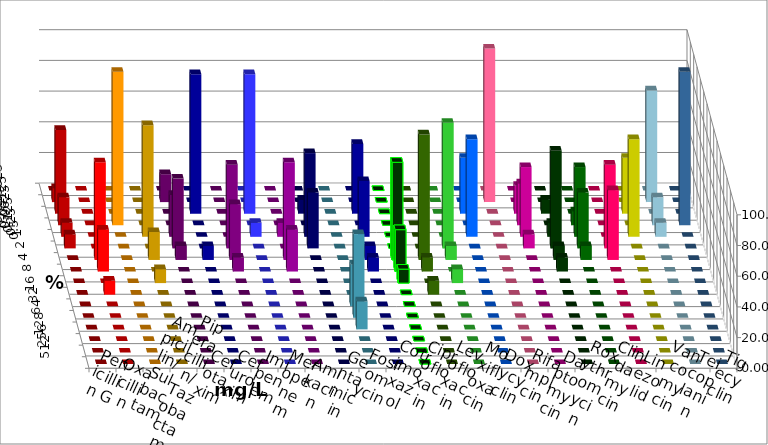
| Category | Penicillin G | Oxacillin | Ampicillin/ Sulbactam | Piperacillin/ Tazobactam | Cefotaxim | Cefuroxim | Imipenem | Meropenem | Amikacin | Gentamicin | Fosfomycin | Cotrimoxazol | Ciprofloxacin | Levofloxacin | Moxifloxacin | Doxycyclin | Rifampicin | Daptomycin | Roxythromycin | Clindamycin | Linezolid | Vancomycin | Teicoplanin | Tigecyclin |
|---|---|---|---|---|---|---|---|---|---|---|---|---|---|---|---|---|---|---|---|---|---|---|---|---|
| 0.015625 | 0 | 0 | 0 | 0 | 0 | 0 | 0 | 0 | 0 | 0 | 0 | 0 | 0 | 0 | 0 | 0 | 0 | 0 | 0 | 0 | 0 | 0 | 0 | 0 |
| 0.03125 | 9.091 | 0 | 0 | 0 | 18.182 | 0 | 0 | 0 | 0 | 0 | 0 | 0 | 0 | 0 | 0 | 0 | 100 | 0 | 0 | 0 | 0 | 0 | 0 | 72.727 |
| 0.0625 | 54.545 | 0 | 0 | 0 | 0 | 0 | 90.909 | 90.909 | 0 | 9.091 | 0 | 45.455 | 0 | 0 | 0 | 36.364 | 0 | 18.182 | 9.091 | 0 | 0 | 36.364 | 0 | 0 |
| 0.125 | 18.182 | 0 | 100 | 0 | 0 | 0 | 0 | 0 | 0 | 0 | 0 | 0 | 0 | 0 | 0 | 0 | 0 | 27.273 | 0 | 9.091 | 0 | 0 | 100 | 18.182 |
| 0.25 | 9.091 | 0 | 0 | 72.727 | 27.273 | 0 | 0 | 9.091 | 9.091 | 54.545 | 0 | 36.364 | 0 | 0 | 0 | 63.636 | 0 | 45.455 | 9.091 | 45.455 | 0 | 63.636 | 0 | 9.091 |
| 0.5 | 9.091 | 0 | 0 | 0 | 45.455 | 54.545 | 0 | 0 | 0 | 36.364 | 0 | 0 | 0 | 0 | 81.818 | 0 | 0 | 9.091 | 63.636 | 36.364 | 54.545 | 0 | 0 | 0 |
| 1.0 | 0 | 63.636 | 0 | 18.182 | 9.091 | 36.364 | 9.091 | 0 | 63.636 | 0 | 0 | 9.091 | 63.636 | 81.818 | 9.091 | 0 | 0 | 0 | 9.091 | 9.091 | 45.455 | 0 | 0 | 0 |
| 2.0 | 0 | 27.273 | 0 | 0 | 0 | 9.091 | 0 | 0 | 27.273 | 0 | 0 | 9.091 | 27.273 | 9.091 | 0 | 0 | 0 | 0 | 9.091 | 0 | 0 | 0 | 0 | 0 |
| 4.0 | 0 | 0 | 0 | 9.091 | 0 | 0 | 0 | 0 | 0 | 0 | 0 | 0 | 9.091 | 0 | 9.091 | 0 | 0 | 0 | 0 | 0 | 0 | 0 | 0 | 0 |
| 8.0 | 0 | 9.091 | 0 | 0 | 0 | 0 | 0 | 0 | 0 | 0 | 0 | 0 | 0 | 9.091 | 0 | 0 | 0 | 0 | 0 | 0 | 0 | 0 | 0 | 0 |
| 16.0 | 0 | 0 | 0 | 0 | 0 | 0 | 0 | 0 | 0 | 0 | 27.273 | 0 | 0 | 0 | 0 | 0 | 0 | 0 | 0 | 0 | 0 | 0 | 0 | 0 |
| 32.0 | 0 | 0 | 0 | 0 | 0 | 0 | 0 | 0 | 0 | 0 | 54.545 | 0 | 0 | 0 | 0 | 0 | 0 | 0 | 0 | 0 | 0 | 0 | 0 | 0 |
| 64.0 | 0 | 0 | 0 | 0 | 0 | 0 | 0 | 0 | 0 | 0 | 18.182 | 0 | 0 | 0 | 0 | 0 | 0 | 0 | 0 | 0 | 0 | 0 | 0 | 0 |
| 128.0 | 0 | 0 | 0 | 0 | 0 | 0 | 0 | 0 | 0 | 0 | 0 | 0 | 0 | 0 | 0 | 0 | 0 | 0 | 0 | 0 | 0 | 0 | 0 | 0 |
| 256.0 | 0 | 0 | 0 | 0 | 0 | 0 | 0 | 0 | 0 | 0 | 0 | 0 | 0 | 0 | 0 | 0 | 0 | 0 | 0 | 0 | 0 | 0 | 0 | 0 |
| 512.0 | 0 | 0 | 0 | 0 | 0 | 0 | 0 | 0 | 0 | 0 | 0 | 0 | 0 | 0 | 0 | 0 | 0 | 0 | 0 | 0 | 0 | 0 | 0 | 0 |